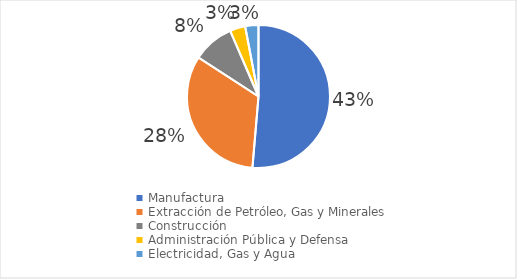
| Category | Series 0 |
|---|---|
| Manufactura | 0.434 |
| Extracción de Petróleo, Gas y Minerales | 0.277 |
| Construcción | 0.079 |
| Administración Pública y Defensa | 0.029 |
| Electricidad, Gas y Agua | 0.025 |